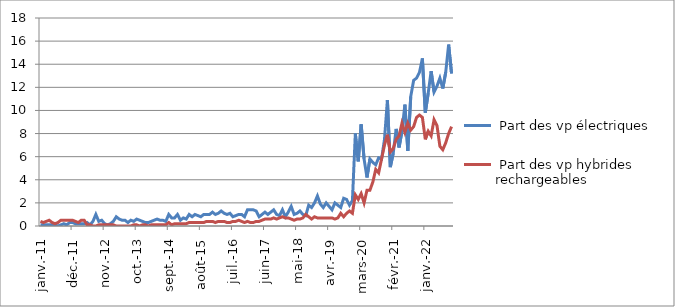
| Category |  Part des vp électriques  |  Part des vp hybrides rechargeables |
|---|---|---|
| 2011-01-01 | 0.1 | 0.4 |
| 2011-02-01 | 0.1 | 0.3 |
| 2011-03-01 | 0.1 | 0.4 |
| 2011-04-01 | 0.1 | 0.5 |
| 2011-05-01 | 0.1 | 0.3 |
| 2011-06-01 | 0.1 | 0.2 |
| 2011-07-01 | 0 | 0.3 |
| 2011-08-01 | 0.1 | 0.5 |
| 2011-09-01 | 0.2 | 0.5 |
| 2011-10-01 | 0.1 | 0.5 |
| 2011-11-01 | 0.3 | 0.5 |
| 2011-12-01 | 0.3 | 0.5 |
| 2012-01-01 | 0.2 | 0.4 |
| 2012-02-01 | 0.2 | 0.3 |
| 2012-03-01 | 0.2 | 0.5 |
| 2012-04-01 | 0.2 | 0.5 |
| 2012-05-01 | 0.3 | 0.1 |
| 2012-06-01 | 0.1 | 0.1 |
| 2012-07-01 | 0.4 | 0 |
| 2012-08-01 | 1 | 0 |
| 2012-09-01 | 0.4 | 0.1 |
| 2012-10-01 | 0.5 | 0.1 |
| 2012-11-01 | 0.2 | 0.1 |
| 2012-12-01 | 0.1 | 0.1 |
| 2013-01-01 | 0.2 | 0.1 |
| 2013-02-01 | 0.4 | 0.1 |
| 2013-03-01 | 0.8 | 0 |
| 2013-04-01 | 0.6 | 0 |
| 2013-05-01 | 0.5 | 0 |
| 2013-06-01 | 0.5 | 0 |
| 2013-07-01 | 0.3 | 0 |
| 2013-08-01 | 0.5 | 0 |
| 2013-09-01 | 0.4 | 0.1 |
| 2013-10-01 | 0.6 | 0.1 |
| 2013-11-01 | 0.5 | 0 |
| 2013-12-01 | 0.4 | 0.1 |
| 2014-01-01 | 0.3 | 0.1 |
| 2014-02-01 | 0.3 | 0 |
| 2014-03-01 | 0.4 | 0.1 |
| 2014-04-01 | 0.5 | 0.1 |
| 2014-05-01 | 0.6 | 0.1 |
| 2014-06-01 | 0.5 | 0.1 |
| 2014-07-01 | 0.5 | 0.1 |
| 2014-08-01 | 0.4 | 0.1 |
| 2014-09-01 | 1 | 0.3 |
| 2014-10-01 | 0.7 | 0.1 |
| 2014-11-01 | 0.7 | 0.2 |
| 2014-12-01 | 1 | 0.2 |
| 2015-01-01 | 0.5 | 0.2 |
| 2015-02-01 | 0.7 | 0.2 |
| 2015-03-01 | 0.6 | 0.2 |
| 2015-04-01 | 1 | 0.3 |
| 2015-05-01 | 0.8 | 0.3 |
| 2015-06-01 | 1 | 0.3 |
| 2015-07-01 | 0.9 | 0.3 |
| 2015-08-01 | 0.8 | 0.3 |
| 2015-09-01 | 1 | 0.3 |
| 2015-10-01 | 1 | 0.4 |
| 2015-11-01 | 1 | 0.4 |
| 2015-12-01 | 1.2 | 0.4 |
| 2016-01-01 | 1 | 0.3 |
| 2016-02-01 | 1.1 | 0.4 |
| 2016-03-01 | 1.3 | 0.4 |
| 2016-04-01 | 1.1 | 0.4 |
| 2016-05-01 | 1 | 0.3 |
| 2016-06-01 | 1.1 | 0.3 |
| 2016-07-01 | 0.8 | 0.4 |
| 2016-08-01 | 0.9 | 0.4 |
| 2016-09-01 | 1 | 0.5 |
| 2016-10-01 | 1 | 0.4 |
| 2016-11-01 | 0.8 | 0.3 |
| 2016-12-01 | 1.4 | 0.4 |
| 2017-01-01 | 1.4 | 0.3 |
| 2017-02-01 | 1.4 | 0.3 |
| 2017-03-01 | 1.3 | 0.4 |
| 2017-04-01 | 0.8 | 0.4 |
| 2017-05-01 | 1 | 0.5 |
| 2017-06-01 | 1.2 | 0.6 |
| 2017-07-01 | 1 | 0.6 |
| 2017-08-01 | 1.2 | 0.6 |
| 2017-09-01 | 1.4 | 0.7 |
| 2017-10-01 | 1 | 0.6 |
| 2017-11-01 | 0.9 | 0.7 |
| 2017-12-01 | 1.4 | 0.8 |
| 2018-01-01 | 0.8 | 0.7 |
| 2018-02-01 | 1.2 | 0.7 |
| 2018-03-01 | 1.7 | 0.6 |
| 2018-04-01 | 1 | 0.5 |
| 2018-05-01 | 1.1 | 0.6 |
| 2018-06-01 | 1.3 | 0.6 |
| 2018-07-01 | 1 | 0.7 |
| 2018-08-01 | 0.9 | 1 |
| 2018-09-01 | 1.8 | 0.8 |
| 2018-10-01 | 1.6 | 0.6 |
| 2018-11-01 | 2 | 0.8 |
| 2018-12-01 | 2.6 | 0.7 |
| 2019-01-01 | 1.9 | 0.7 |
| 2019-02-01 | 1.6 | 0.7 |
| 2019-03-01 | 2 | 0.7 |
| 2019-04-01 | 1.7 | 0.7 |
| 2019-05-01 | 1.4 | 0.7 |
| 2019-06-01 | 2 | 0.6 |
| 2019-07-01 | 1.8 | 0.7 |
| 2019-08-01 | 1.6 | 1.1 |
| 2019-09-01 | 2.4 | 0.8 |
| 2019-10-01 | 2.3 | 1.1 |
| 2019-11-01 | 1.8 | 1.3 |
| 2019-12-01 | 2.2 | 1.1 |
| 2020-01-01 | 8 | 2.7 |
| 2020-02-01 | 5.6 | 2.3 |
| 2020-03-01 | 8.8 | 2.8 |
| 2020-04-01 | 5.8 | 2 |
| 2020-05-01 | 4.2 | 3.1 |
| 2020-06-01 | 5.8 | 3.1 |
| 2020-07-01 | 5.5 | 3.8 |
| 2020-08-01 | 5.3 | 4.9 |
| 2020-09-01 | 5.9 | 4.6 |
| 2020-10-01 | 5.8 | 5.8 |
| 2020-11-01 | 7.5 | 7 |
| 2020-12-01 | 10.9 | 7.9 |
| 2021-01-01 | 5.1 | 6.4 |
| 2021-02-01 | 6.3 | 6.7 |
| 2021-03-01 | 8.4 | 7.5 |
| 2021-04-01 | 6.8 | 7.8 |
| 2021-05-01 | 8.2 | 8.9 |
| 2021-06-01 | 10.5 | 8.1 |
| 2021-07-01 | 6.5 | 8.9 |
| 2021-08-01 | 11.2 | 8.3 |
| 2021-09-01 | 12.6 | 8.6 |
| 2021-10-01 | 12.8 | 9.4 |
| 2021-11-01 | 13.3 | 9.6 |
| 2021-12-01 | 14.5 | 9.4 |
| 2022-01-01 | 9.8 | 7.5 |
| 2022-02-01 | 11.5 | 8.2 |
| 2022-03-01 | 13.4 | 7.8 |
| 2022-04-01 | 11.6 | 9.2 |
| 2022-05-01 | 12.1 | 8.7 |
| 2022-06-01 | 12.8 | 6.9 |
| 2022-07-01 | 11.9 | 6.6 |
| 2022-08-01 | 13.3 | 7.2 |
| 2022-09-01 | 15.7 | 8 |
| 2022-10-01 | 13.2 | 8.6 |